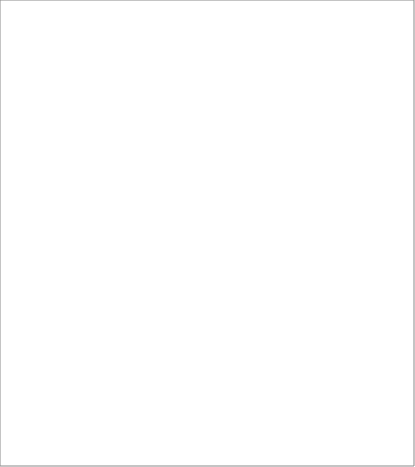
| Category | Series 0 |
|---|---|
| Energoefektivitātes politika, ekonomikas veicināšana, atbalsts biodegvielas ražošanas veicināšanai | -40188.439 |
| Mērķdotācijas autoceļiem un to pārvaldīšana | -4511460.582 |
| Vispārējie ekonomiskie, komerciālie un nodarbinātības publiskie pakalpojumi | -360329.876 |
| Dotācijas sabiedriskā transporta pārvadājumu organizēšana, zaudējumu segšanai un lidostai "Rīga" | -7645522.245 |
| Valsts atbalsts lauksaimniecībai un lauku attīstībai, lauksaimniecības risku fonds un citi atbalsta pasākumi mežu nozarē un zivsaimniecībā | -2095014.64 |
| Tūrisma attīstība, datordrošība, pasta darbība, pašvaldību un reģionu pārvaldes pakalpojumi | -1383798.992 |